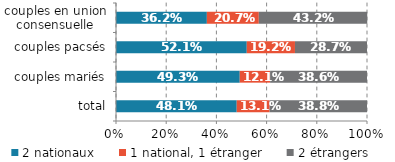
| Category | 2 nationaux | 1 national, 1 étranger | 2 étrangers |
|---|---|---|---|
| total | 0.481 | 0.131 | 0.388 |
| couples mariés | 0.493 | 0.121 | 0.386 |
| couples pacsés | 0.521 | 0.192 | 0.287 |
| couples en union consensuelle | 0.362 | 0.207 | 0.432 |